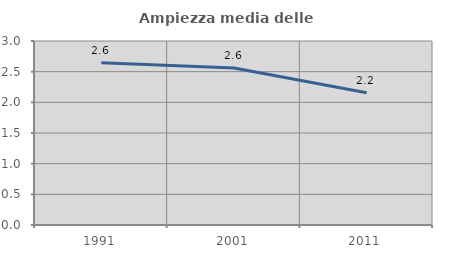
| Category | Ampiezza media delle famiglie |
|---|---|
| 1991.0 | 2.645 |
| 2001.0 | 2.559 |
| 2011.0 | 2.158 |